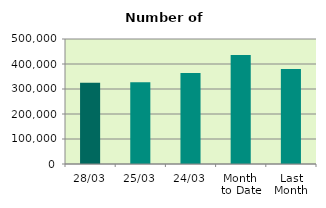
| Category | Series 0 |
|---|---|
| 28/03 | 325020 |
| 25/03 | 327084 |
| 24/03 | 363594 |
| Month 
to Date | 436048.2 |
| Last
Month | 380345.4 |